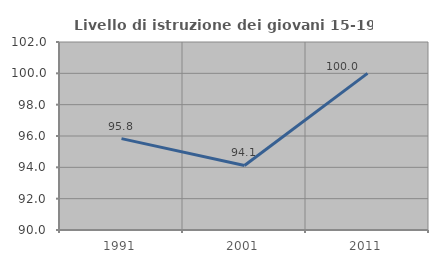
| Category | Livello di istruzione dei giovani 15-19 anni |
|---|---|
| 1991.0 | 95.833 |
| 2001.0 | 94.118 |
| 2011.0 | 100 |